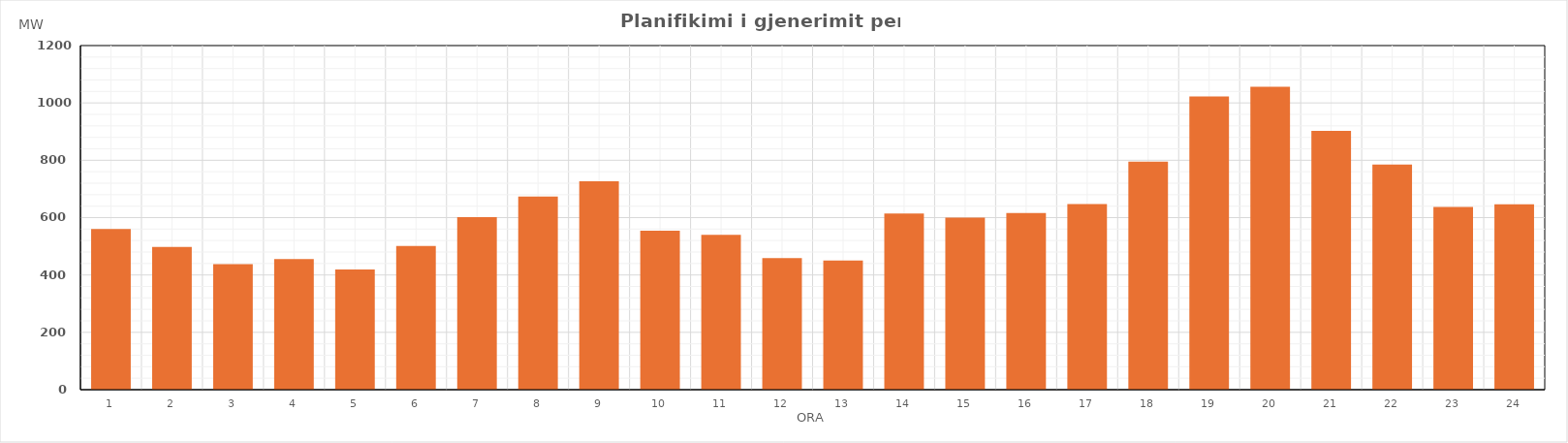
| Category | Max (MW) |
|---|---|
| 0 | 560.54 |
| 1 | 497.95 |
| 2 | 437.81 |
| 3 | 455.48 |
| 4 | 419.56 |
| 5 | 501.11 |
| 6 | 602.02 |
| 7 | 673.8 |
| 8 | 726.7 |
| 9 | 554.44 |
| 10 | 540.36 |
| 11 | 458.68 |
| 12 | 450.46 |
| 13 | 614.32 |
| 14 | 599.98 |
| 15 | 615.72 |
| 16 | 646.94 |
| 17 | 795.43 |
| 18 | 1022.92 |
| 19 | 1056.69 |
| 20 | 902.12 |
| 21 | 784.7 |
| 22 | 637.29 |
| 23 | 646.42 |